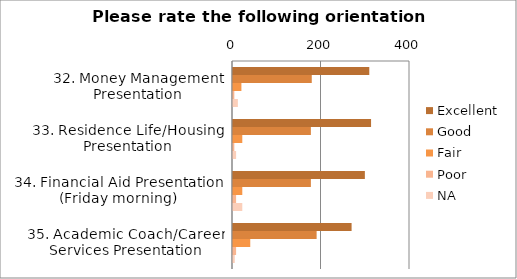
| Category | Excellent | Good | Fair | Poor | NA |
|---|---|---|---|---|---|
| 32. Money Management Presentation | 308 | 178 | 19 | 3 | 11 |
| 33. Residence Life/Housing Presentation | 312 | 176 | 21 | 3 | 7 |
| 34. Financial Aid Presentation (Friday morning) | 298 | 176 | 21 | 7 | 21 |
| 35. Academic Coach/Career Services Presentation | 268 | 189 | 39 | 7 | 4 |